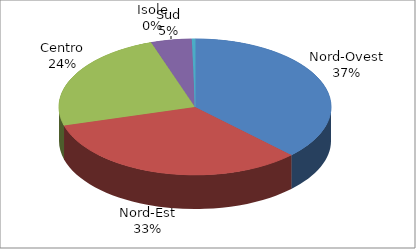
| Category | Series 0 |
|---|---|
| Nord-Ovest | 15500 |
| Nord-Est | 13691 |
| Centro | 10001 |
| Sud | 2003 |
| Isole | 156 |